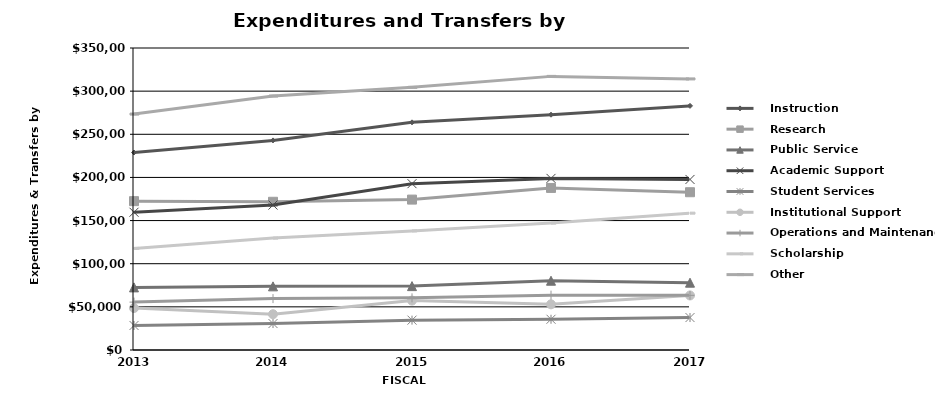
| Category |    Instruction |    Research |    Public Service |    Academic Support |    Student Services |    Institutional Support |    Operations and Maintenance |    Scholarship |    Other |
|---|---|---|---|---|---|---|---|---|---|
| 0 | 228861 | 172511 | 72568 | 159651 | 28425 | 48651 | 55487 | 117747 | 273436 |
| 1 | 242906 | 171785 | 73764 | 167969 | 30664 | 41472 | 59547 | 129691 | 294325 |
| 2 | 263854 | 174300 | 74037 | 192778 | 34613 | 57265 | 60440 | 138042 | 304396 |
| 3 | 272688 | 187807 | 80301 | 198889 | 35623 | 52922 | 63590 | 147065 | 317113 |
| 4 | 282943 | 182846 | 78027 | 197661 | 37622 | 63217 | 63317 | 158591 | 314169 |